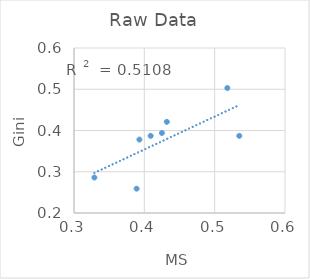
| Category | raw-gini |
|---|---|
| 0.535 | 0.387 |
| 0.409 | 0.387 |
| 0.518 | 0.503 |
| 0.393 | 0.378 |
| 0.329 | 0.286 |
| 0.425 | 0.394 |
| 0.432 | 0.421 |
| 0.389 | 0.259 |